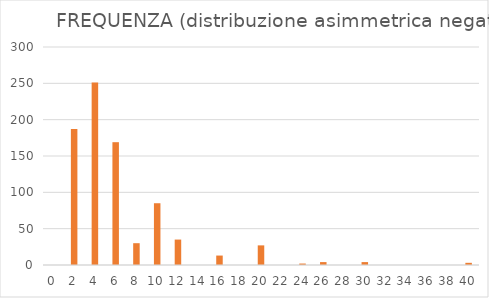
| Category | FREQUENZA |
|---|---|
| 0.0 | 0 |
| 2.0 | 187 |
| 4.0 | 251 |
| 6.0 | 169 |
| 8.0 | 30 |
| 10.0 | 85 |
| 12.0 | 35 |
| 14.0 | 0 |
| 16.0 | 13 |
| 18.0 | 0 |
| 20.0 | 27 |
| 22.0 | 0 |
| 24.0 | 2 |
| 26.0 | 4 |
| 28.0 | 0 |
| 30.0 | 4 |
| 32.0 | 0 |
| 34.0 | 0 |
| 36.0 | 0 |
| 38.0 | 0 |
| 40.0 | 3 |